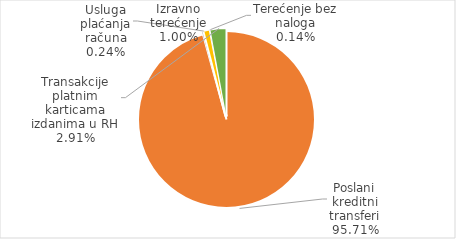
| Category | Ukupno | Series 1 |
|---|---|---|
|  | 0 |  |
| Poslani kreditni transferi | 2181733638720 |  |
| Usluga plaćanja računa | 5404906960 |  |
| Izravno terećenje | 22893521426 |  |
| Terećenje bez naloga | 3117091423 |  |
| Transakcije platnim karticama izdanima u RH | 66339740534 |  |